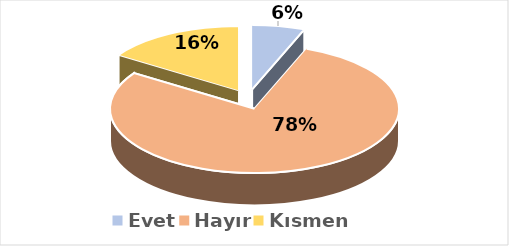
| Category | Evet |
|---|---|
| Evet | 0.059 |
| Hayır | 0.784 |
| Kısmen | 0.157 |